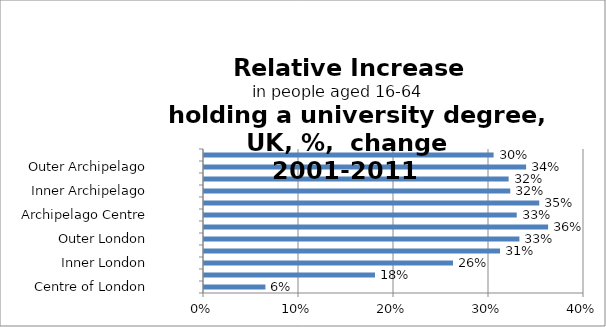
| Category | Series 0 |
|---|---|
| Centre of London | 0.065 |
| London Core | 0.18 |
| Inner London | 0.262 |
| London Suburbs | 0.312 |
| Outer London | 0.332 |
| London Edge | 0.362 |
| Archipelago Centre | 0.329 |
| Archipelago Core | 0.353 |
| Inner Archipelago | 0.322 |
| Archipelago Suburbs | 0.321 |
| Outer Archipelago | 0.339 |
| Archipelago Edge | 0.305 |